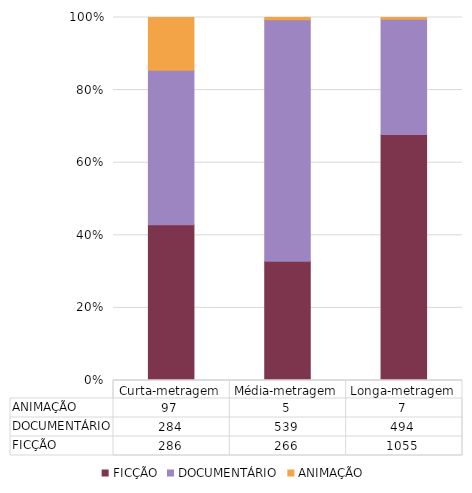
| Category | FICÇÃO | DOCUMENTÁRIO | ANIMAÇÃO |
|---|---|---|---|
| Curta-metragem | 286 | 284 | 97 |
| Média-metragem | 266 | 539 | 5 |
| Longa-metragem | 1055 | 494 | 7 |